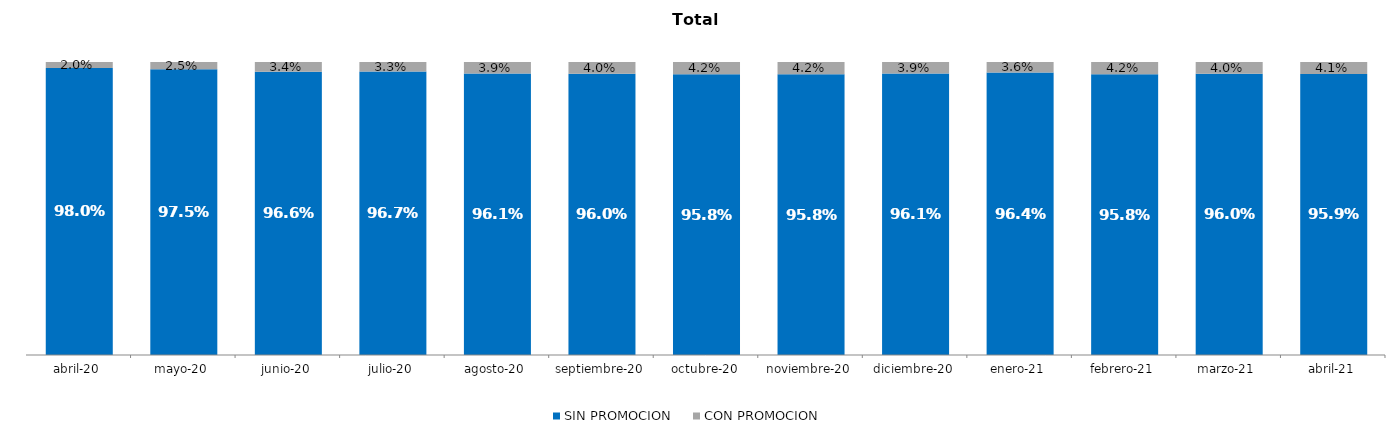
| Category | SIN PROMOCION   | CON PROMOCION   |
|---|---|---|
| 2020-04-01 | 0.98 | 0.02 |
| 2020-05-01 | 0.975 | 0.025 |
| 2020-06-01 | 0.966 | 0.034 |
| 2020-07-01 | 0.967 | 0.033 |
| 2020-08-01 | 0.961 | 0.039 |
| 2020-09-01 | 0.96 | 0.04 |
| 2020-10-01 | 0.958 | 0.042 |
| 2020-11-01 | 0.958 | 0.042 |
| 2020-12-01 | 0.961 | 0.039 |
| 2021-01-01 | 0.964 | 0.036 |
| 2021-02-01 | 0.958 | 0.042 |
| 2021-03-01 | 0.96 | 0.04 |
| 2021-04-01 | 0.959 | 0.041 |